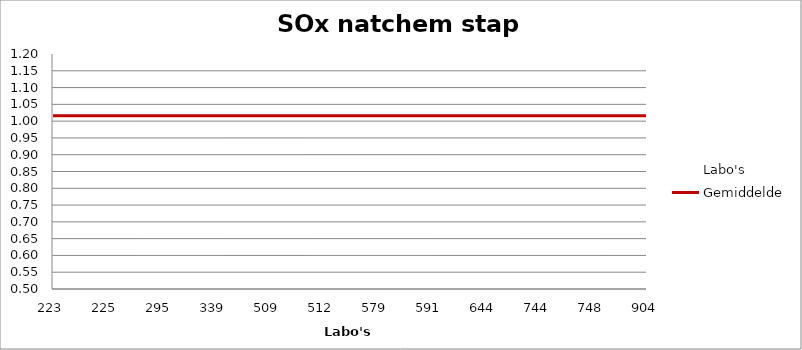
| Category | Labo's | Gemiddelde |
|---|---|---|
| 223.0 | 1.042 | 1.016 |
| 225.0 | 0.964 | 1.016 |
| 295.0 | 1.032 | 1.016 |
| 339.0 | 0.963 | 1.016 |
| 509.0 | 1.101 | 1.016 |
| 512.0 | 1.042 | 1.016 |
| 579.0 | 0.98 | 1.016 |
| 591.0 | 0.953 | 1.016 |
| 644.0 | 1.181 | 1.016 |
| 744.0 | 1.002 | 1.016 |
| 748.0 | 0.535 | 1.016 |
| 904.0 | 1.081 | 1.016 |